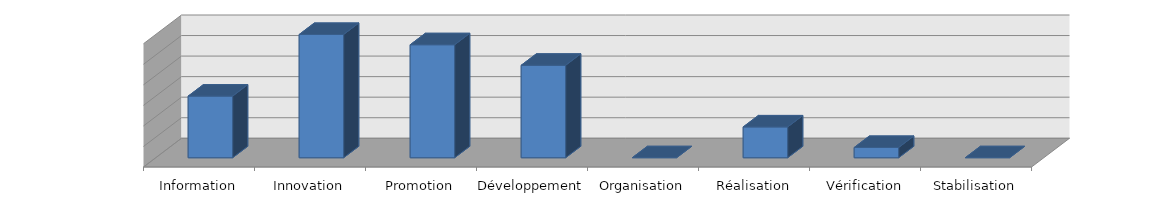
| Category | Series 0 |
|---|---|
| Information | 6 |
| Innovation | 12 |
| Promotion | 11 |
| Développement | 9 |
| Organisation | 0 |
| Réalisation | 3 |
| Vérification | 1 |
| Stabilisation | 0 |